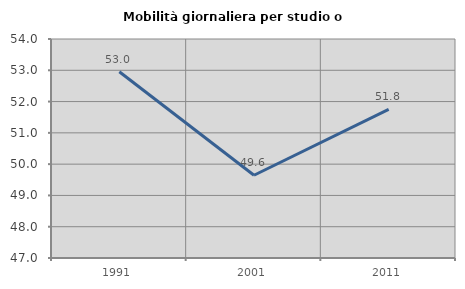
| Category | Mobilità giornaliera per studio o lavoro |
|---|---|
| 1991.0 | 52.955 |
| 2001.0 | 49.645 |
| 2011.0 | 51.753 |